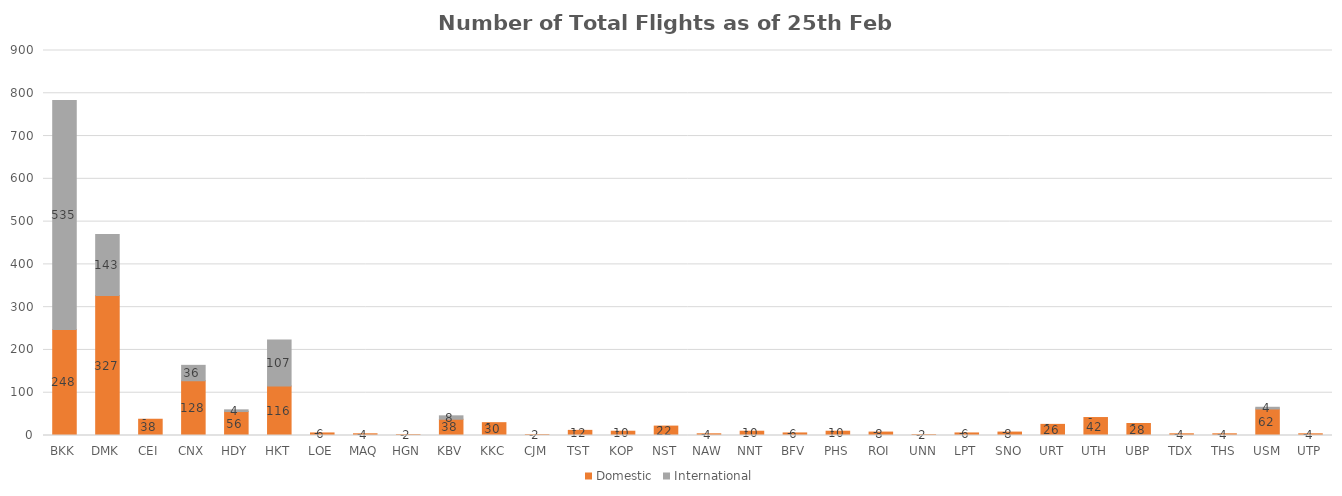
| Category | Domestic | International |
|---|---|---|
| BKK | 248 | 535 |
| DMK | 327 | 143 |
| CEI | 38 | 0 |
| CNX | 128 | 36 |
| HDY | 56 | 4 |
| HKT | 116 | 107 |
| LOE | 6 | 0 |
| MAQ | 4 | 0 |
| HGN | 2 | 0 |
| KBV | 38 | 8 |
| KKC | 30 | 0 |
| CJM | 2 | 0 |
| TST | 12 | 0 |
| KOP | 10 | 0 |
| NST | 22 | 0 |
| NAW | 4 | 0 |
| NNT | 10 | 0 |
| BFV | 6 | 0 |
| PHS | 10 | 0 |
| ROI | 8 | 0 |
| UNN | 2 | 0 |
| LPT | 6 | 0 |
| SNO | 8 | 0 |
| URT | 26 | 0 |
| UTH | 42 | 0 |
| UBP | 28 | 0 |
| TDX | 4 | 0 |
| THS | 4 | 0 |
| USM | 62 | 4 |
| UTP | 4 | 0 |